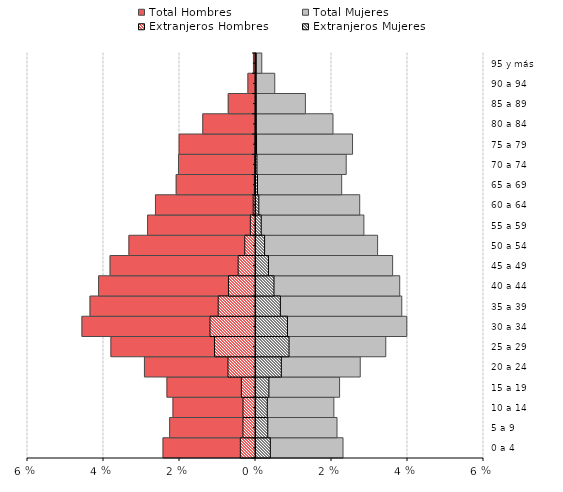
| Category | Total Hombres | Total Mujeres | Extranjeros Hombres | Extranjeros Mujeres |
|---|---|---|---|---|
| 0 a 4 | -0.024 | 0.023 | -0.004 | 0.004 |
| 5 a 9 | -0.023 | 0.021 | -0.003 | 0.003 |
| 10 a 14 | -0.022 | 0.02 | -0.003 | 0.003 |
| 15 a 19 | -0.023 | 0.022 | -0.004 | 0.003 |
| 20 a 24 | -0.029 | 0.027 | -0.007 | 0.007 |
| 25 a 29 | -0.038 | 0.034 | -0.011 | 0.009 |
| 30 a 34 | -0.046 | 0.04 | -0.012 | 0.008 |
| 35 a 39 | -0.044 | 0.038 | -0.01 | 0.006 |
| 40 a 44 | -0.041 | 0.038 | -0.007 | 0.005 |
| 45 a 49 | -0.038 | 0.036 | -0.005 | 0.003 |
| 50 a 54 | -0.033 | 0.032 | -0.003 | 0.002 |
| 55 a 59 | -0.028 | 0.028 | -0.001 | 0.001 |
| 60 a 64 | -0.026 | 0.027 | -0.001 | 0.001 |
| 65 a 69 | -0.021 | 0.023 | 0 | 0 |
| 70 a 74 | -0.02 | 0.024 | 0 | 0 |
| 75 a 79 | -0.02 | 0.025 | 0 | 0 |
| 80 a 84 | -0.014 | 0.02 | 0 | 0 |
| 85 a 89 | -0.007 | 0.013 | 0 | 0 |
| 90 a 94 | -0.002 | 0.005 | 0 | 0 |
| 95 y más | -0.001 | 0.002 | 0 | 0 |